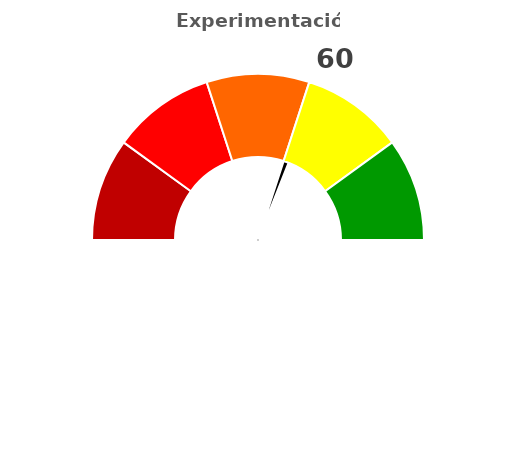
| Category | refe |
|---|---|
| 0 | 60 |
| 1 | 2 |
| 2 | 138 |